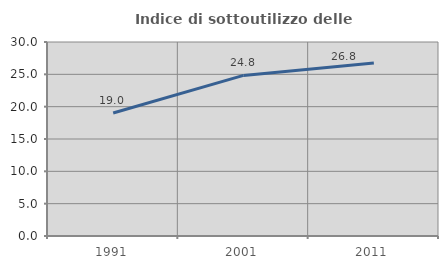
| Category | Indice di sottoutilizzo delle abitazioni  |
|---|---|
| 1991.0 | 19.027 |
| 2001.0 | 24.836 |
| 2011.0 | 26.751 |